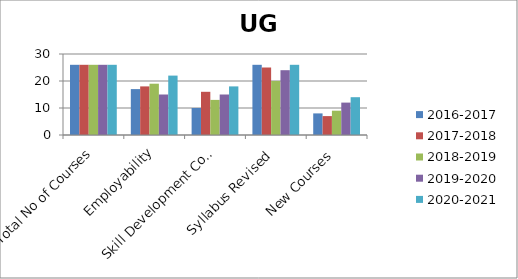
| Category | 2016-2017 | 2017-2018 | 2018-2019 | 2019-2020 | 2020-2021 |
|---|---|---|---|---|---|
| Total No of Courses | 26 | 26 | 26 | 26 | 26 |
| Employability | 17 | 18 | 19 | 15 | 22 |
| Skill Development Courses | 10 | 16 | 13 | 15 | 18 |
| Syllabus Revised | 26 | 25 | 20 | 24 | 26 |
| New Courses | 8 | 7 | 9 | 12 | 14 |